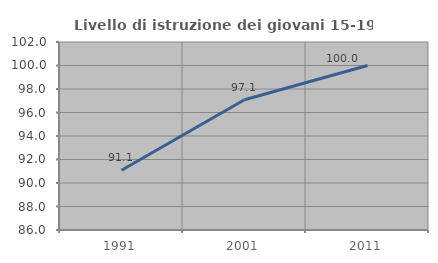
| Category | Livello di istruzione dei giovani 15-19 anni |
|---|---|
| 1991.0 | 91.083 |
| 2001.0 | 97.08 |
| 2011.0 | 100 |